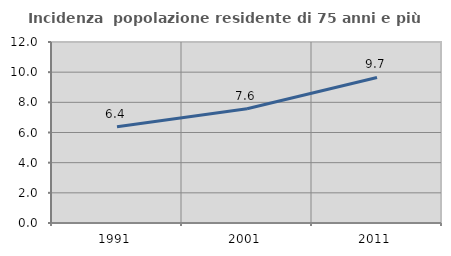
| Category | Incidenza  popolazione residente di 75 anni e più |
|---|---|
| 1991.0 | 6.378 |
| 2001.0 | 7.571 |
| 2011.0 | 9.651 |